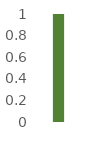
| Category | #¡REF! |
|---|---|
| Avance | 1 |